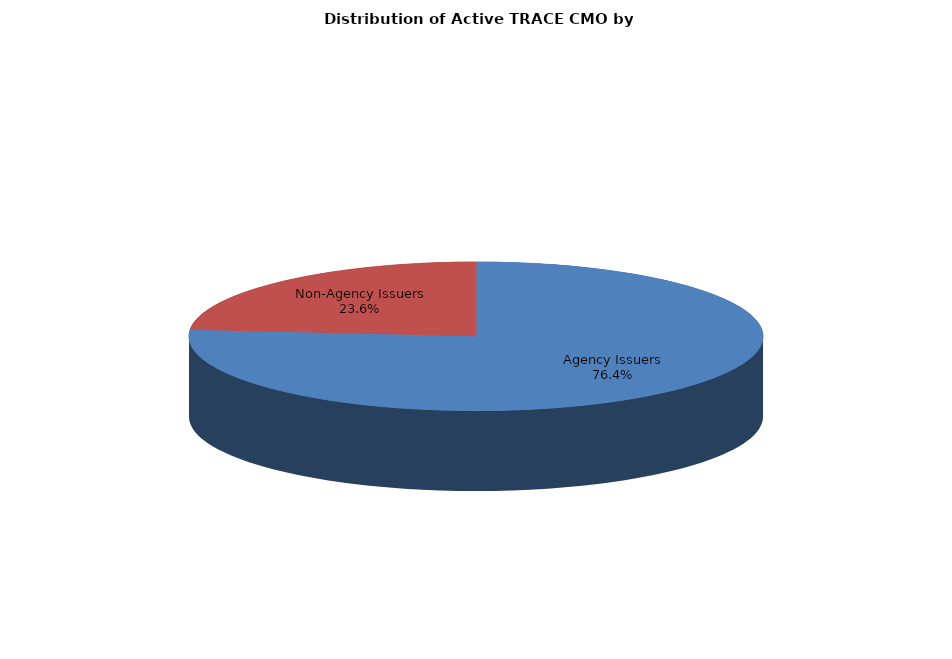
| Category | Series 0 |
|---|---|
| Agency Issuers | 187570 |
| Non-Agency Issuers | 57970 |